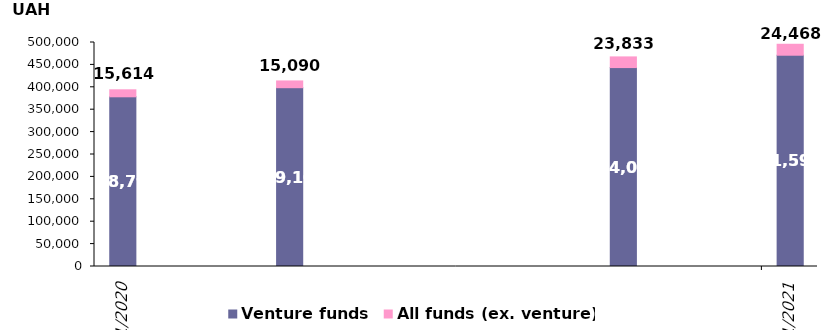
| Category | Venture funds | All funds (ex. venture) |
|---|---|---|
| 9/30/20 | 378795.599 | 15614.401 |
| 12/31/20 | 399103.175 | 15089.679 |
| 6/30/21 | 444027.692 | 23832.89 |
| 9/30/21 | 471598.282 | 24468.121 |